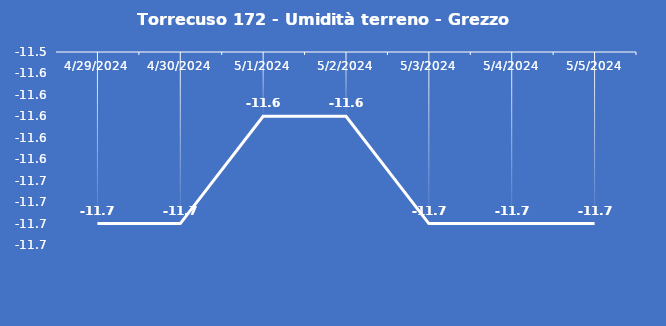
| Category | Torrecuso 172 - Umidità terreno - Grezzo (%VWC) |
|---|---|
| 4/29/24 | -11.7 |
| 4/30/24 | -11.7 |
| 5/1/24 | -11.6 |
| 5/2/24 | -11.6 |
| 5/3/24 | -11.7 |
| 5/4/24 | -11.7 |
| 5/5/24 | -11.7 |